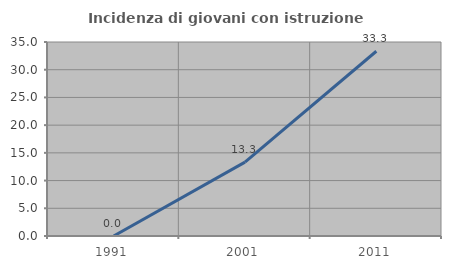
| Category | Incidenza di giovani con istruzione universitaria |
|---|---|
| 1991.0 | 0 |
| 2001.0 | 13.333 |
| 2011.0 | 33.333 |